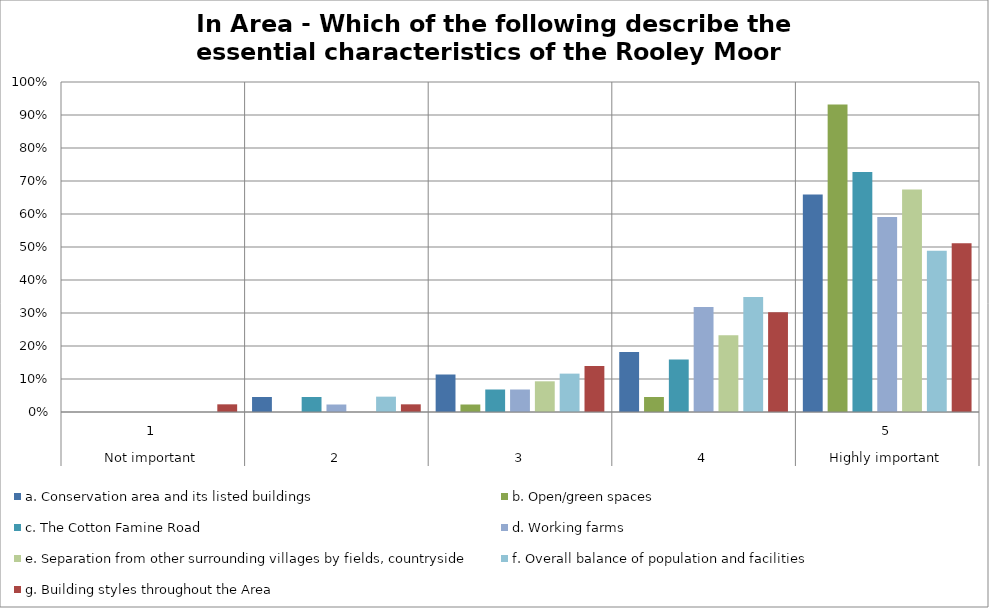
| Category | a. Conservation area and its listed buildings | b. Open/green spaces | c. The Cotton Famine Road | d. Working farms | e. Separation from other surrounding villages by fields, countryside | f. Overall balance of population and facilities | g. Building styles throughout the Area |
|---|---|---|---|---|---|---|---|
| 0 | 0 | 0 | 0 | 0 | 0 | 0 | 0.023 |
| 1 | 0.045 | 0 | 0.045 | 0.023 | 0 | 0.047 | 0.023 |
| 2 | 0.114 | 0.023 | 0.068 | 0.068 | 0.093 | 0.116 | 0.14 |
| 3 | 0.182 | 0.045 | 0.159 | 0.318 | 0.233 | 0.349 | 0.302 |
| 4 | 0.659 | 0.932 | 0.727 | 0.591 | 0.674 | 0.488 | 0.512 |